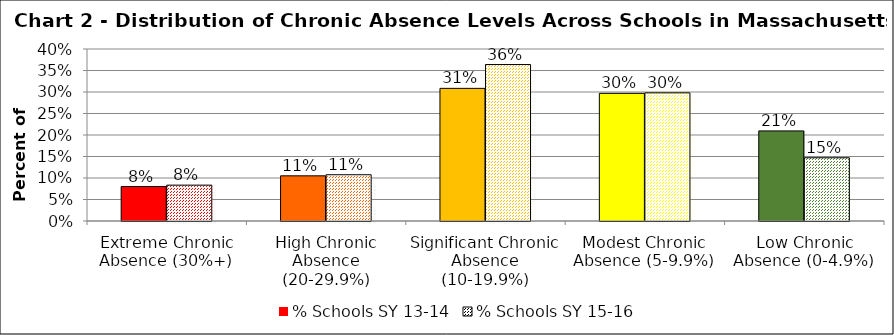
| Category | % Schools SY 13-14 | % Schools SY 15-16 |
|---|---|---|
| Extreme Chronic Absence (30%+) | 0.08 | 0.083 |
| High Chronic Absence (20-29.9%) | 0.105 | 0.108 |
| Significant Chronic Absence (10-19.9%) | 0.308 | 0.364 |
| Modest Chronic Absence (5-9.9%) | 0.297 | 0.298 |
| Low Chronic Absence (0-4.9%) | 0.21 | 0.147 |